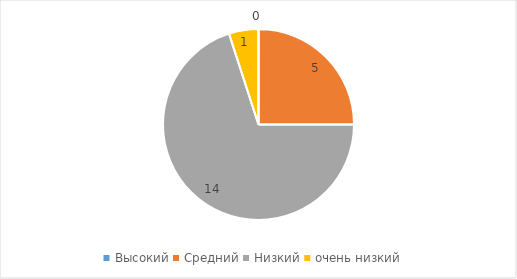
| Category | Series 0 |
|---|---|
| Высокий | 0 |
| Средний | 5 |
| Низкий | 14 |
| очень низкий | 1 |